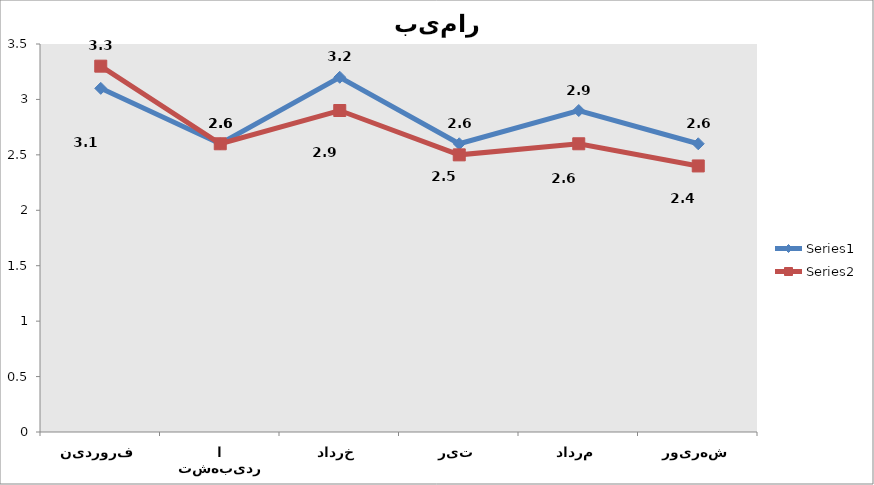
| Category | Series 0 | Series 1 |
|---|---|---|
| فروردین | 3.1 | 3.3 |
| اردیبهشت | 2.6 | 2.6 |
| خرداد | 3.2 | 2.9 |
| تیر | 2.6 | 2.5 |
| مرداد | 2.9 | 2.6 |
| شهریور | 2.6 | 2.4 |